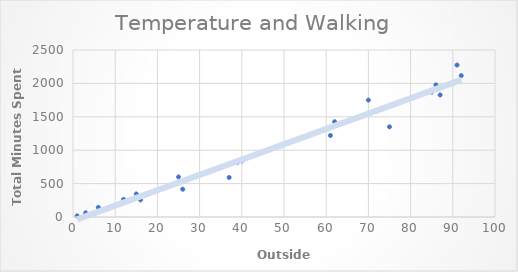
| Category | Series 0 |
|---|---|
| 92.0 | 2116 |
| 86.0 | 1978 |
| 39.0 | 819 |
| 25.0 | 600 |
| 3.0 | 63 |
| 37.0 | 592 |
| 26.0 | 416 |
| 6.0 | 144 |
| 16.0 | 256 |
| 85.0 | 1870 |
| 17.0 | 323 |
| 12.0 | 264 |
| 91.0 | 2275 |
| 40.0 | 840 |
| 16.0 | 304 |
| 70.0 | 1750 |
| 75.0 | 1350 |
| 61.0 | 1220 |
| 1.0 | 17 |
| 15.0 | 345 |
| 87.0 | 1827 |
| 62.0 | 1426 |